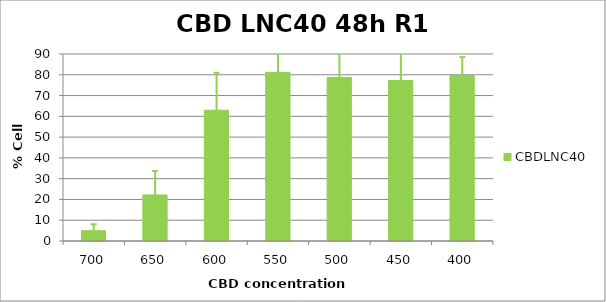
| Category | CBDLNC40 |
|---|---|
| 700.0 | 4.944 |
| 650.0 | 22.159 |
| 600.0 | 62.929 |
| 550.0 | 81.164 |
| 500.0 | 78.75 |
| 450.0 | 77.204 |
| 400.0 | 79.611 |